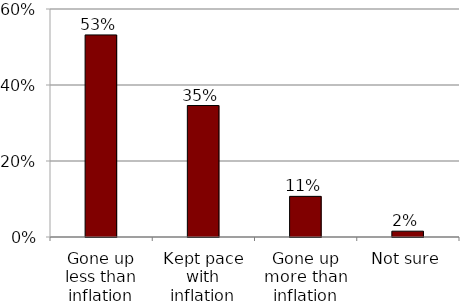
| Category | Series 1 |
|---|---|
| Gone up less than inflation | 0.532 |
| Kept pace with inflation | 0.346 |
| Gone up more than inflation | 0.107 |
| Not sure | 0.015 |